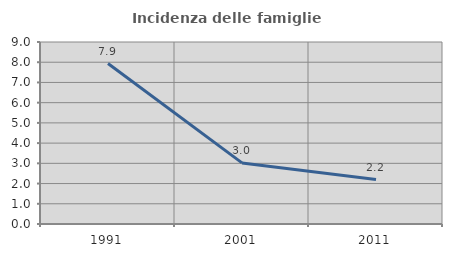
| Category | Incidenza delle famiglie numerose |
|---|---|
| 1991.0 | 7.937 |
| 2001.0 | 3.021 |
| 2011.0 | 2.198 |